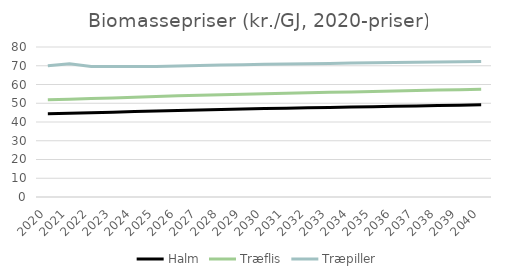
| Category | Halm | Træflis | Træpiller |
|---|---|---|---|
| 2020.0 | 44.374 | 51.838 | 69.994 |
| 2021.0 | 44.641 | 52.151 | 71.068 |
| 2022.0 | 44.942 | 52.502 | 69.589 |
| 2023.0 | 45.251 | 52.863 | 69.594 |
| 2024.0 | 45.566 | 53.231 | 69.605 |
| 2025.0 | 45.872 | 53.589 | 69.608 |
| 2026.0 | 46.176 | 53.944 | 69.92 |
| 2027.0 | 46.426 | 54.236 | 70.141 |
| 2028.0 | 46.674 | 54.526 | 70.356 |
| 2029.0 | 46.919 | 54.811 | 70.566 |
| 2030.0 | 47.162 | 55.096 | 70.772 |
| 2031.0 | 47.36 | 55.327 | 70.922 |
| 2032.0 | 47.573 | 55.576 | 71.098 |
| 2033.0 | 47.782 | 55.82 | 71.264 |
| 2034.0 | 47.987 | 56.06 | 71.425 |
| 2035.0 | 48.189 | 56.295 | 71.578 |
| 2036.0 | 48.391 | 56.532 | 71.732 |
| 2037.0 | 48.594 | 56.769 | 71.885 |
| 2038.0 | 48.793 | 57.002 | 72.032 |
| 2039.0 | 48.989 | 57.23 | 72.171 |
| 2040.0 | 49.181 | 57.455 | 72.306 |